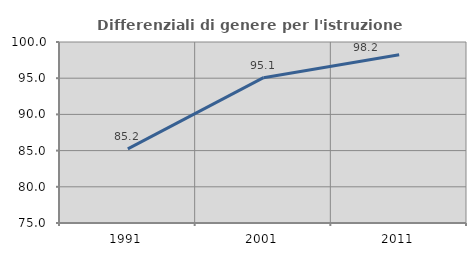
| Category | Differenziali di genere per l'istruzione superiore |
|---|---|
| 1991.0 | 85.249 |
| 2001.0 | 95.07 |
| 2011.0 | 98.246 |